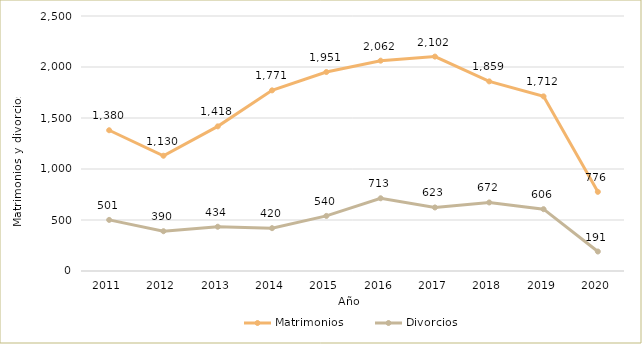
| Category | Matrimonios | Divorcios |
|---|---|---|
| 2011.0 | 1380 | 501 |
| 2012.0 | 1130 | 390 |
| 2013.0 | 1418 | 434 |
| 2014.0 | 1771 | 420 |
| 2015.0 | 1951 | 540 |
| 2016.0 | 2062 | 713 |
| 2017.0 | 2102 | 623 |
| 2018.0 | 1859 | 672 |
| 2019.0 | 1712 | 606 |
| 2020.0 | 776 | 191 |